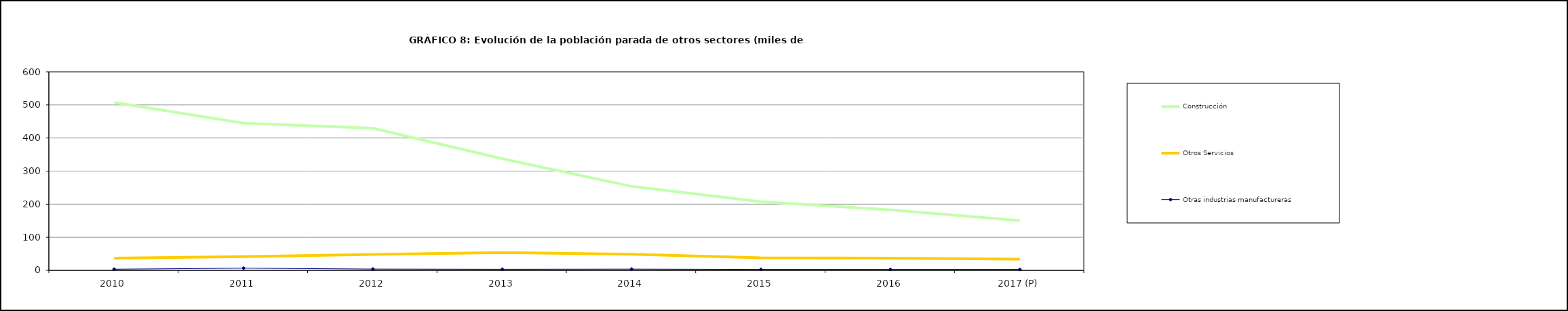
| Category | Construcción | Otros Servicios | Otras industrias manufactureras |
|---|---|---|---|
| 2010 | 507.325 | 36.775 | 3.475 |
| 2011 | 445 | 41.375 | 6.55 |
| 2012 | 429.35 | 48.3 | 3.85 |
| 2013 | 337.3 | 53.6 | 3.3 |
| 2014 | 253.7 | 48.725 | 3.775 |
| 2015 | 207.3 | 38 | 2.9 |
| 2016 | 182.7 | 36.7 | 2.8 |
| 2017 (P) | 150.3 | 33.7 | 2.8 |